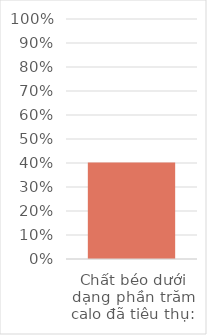
| Category | Series 0 |
|---|---|
| Chất béo dưới dạng phần trăm calo đã tiêu thụ: | 0.402 |